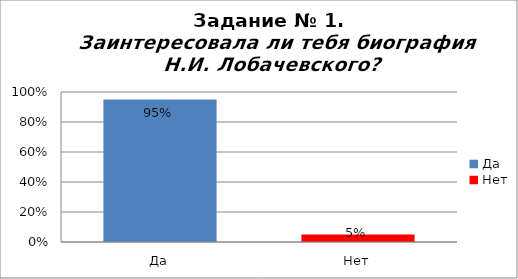
| Category | Заинтересовала ли тебя биография Н.И. Лобачевского? |
|---|---|
| Да | 0.95 |
| Нет | 0.05 |